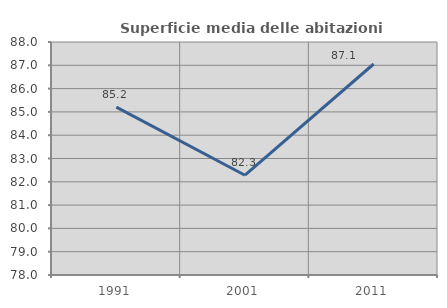
| Category | Superficie media delle abitazioni occupate |
|---|---|
| 1991.0 | 85.203 |
| 2001.0 | 82.282 |
| 2011.0 | 87.056 |